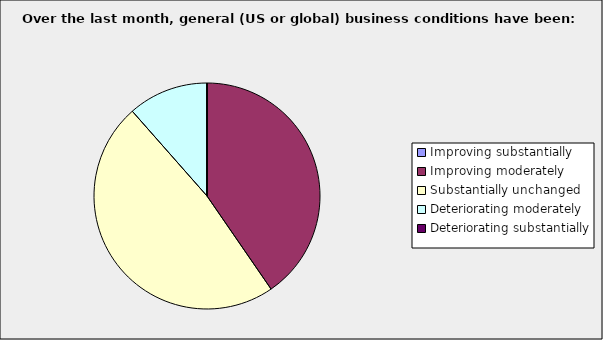
| Category | Series 0 |
|---|---|
| Improving substantially | 0 |
| Improving moderately | 0.404 |
| Substantially unchanged | 0.481 |
| Deteriorating moderately | 0.115 |
| Deteriorating substantially | 0 |